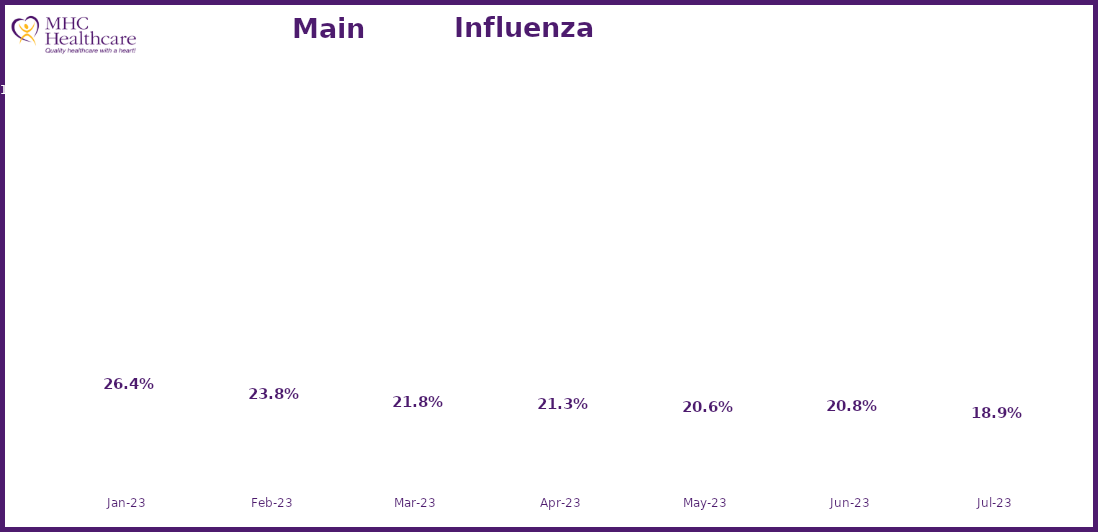
| Category | Online Access to Health Information |
|---|---|
| 2023-01-01 | 0.264 |
| 2023-02-01 | 0.238 |
| 2023-03-01 | 0.218 |
| 2023-04-01 | 0.213 |
| 2023-05-01 | 0.206 |
| 2023-06-01 | 0.208 |
| 2023-07-01 | 0.189 |